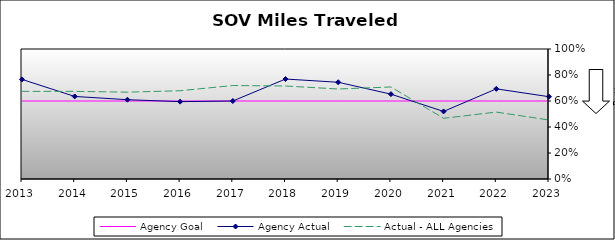
| Category | Agency Goal | Agency Actual | Actual - ALL Agencies |
|---|---|---|---|
| 2013.0 | 0.6 | 0.766 | 0.674 |
| 2014.0 | 0.6 | 0.635 | 0.674 |
| 2015.0 | 0.6 | 0.61 | 0.668 |
| 2016.0 | 0.6 | 0.595 | 0.679 |
| 2017.0 | 0.6 | 0.6 | 0.719 |
| 2018.0 | 0.6 | 0.769 | 0.715 |
| 2019.0 | 0.6 | 0.744 | 0.692 |
| 2020.0 | 0.6 | 0.653 | 0.708 |
| 2021.0 | 0.6 | 0.52 | 0.467 |
| 2022.0 | 0.6 | 0.693 | 0.515 |
| 2023.0 | 0.6 | 0.633 | 0.454 |